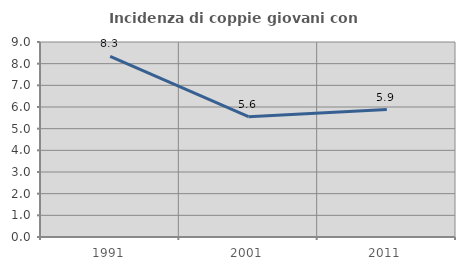
| Category | Incidenza di coppie giovani con figli |
|---|---|
| 1991.0 | 8.333 |
| 2001.0 | 5.556 |
| 2011.0 | 5.882 |